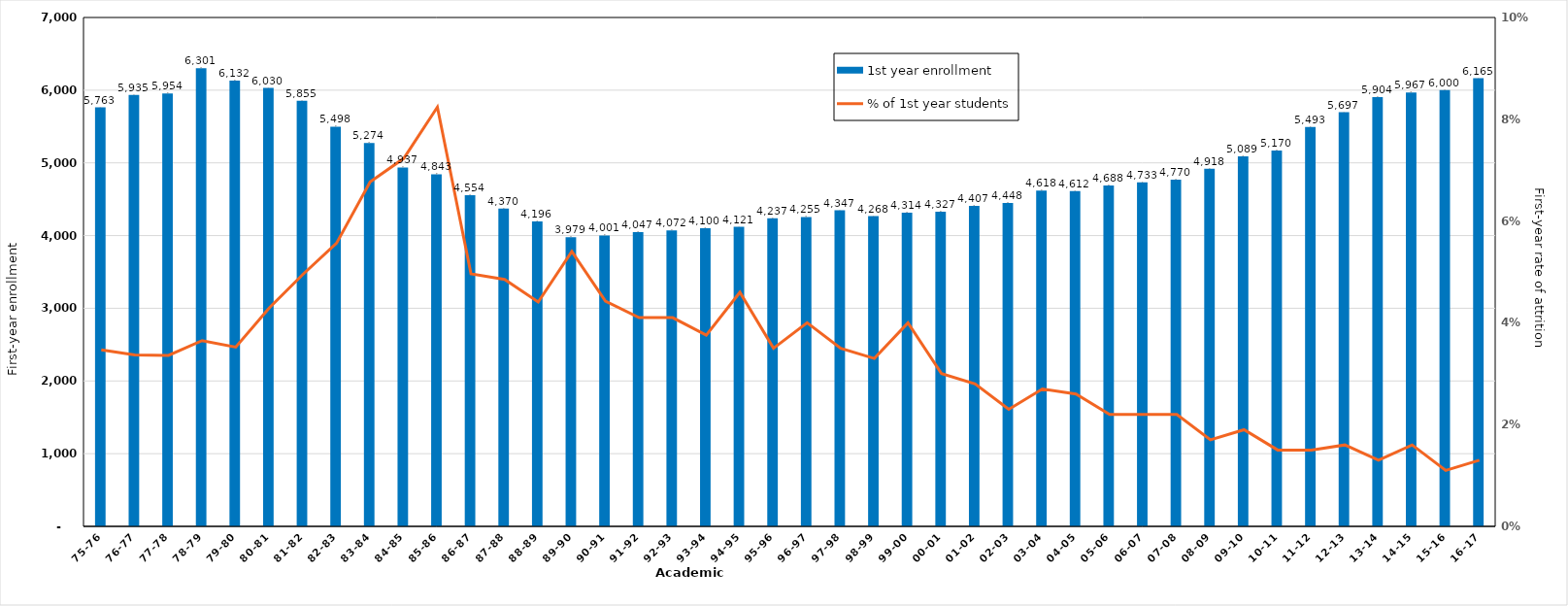
| Category | 1st year enrollment |
|---|---|
| 75-76 | 5763 |
| 76-77 | 5935 |
| 77-78 | 5954 |
| 78-79 | 6301 |
| 79-80 | 6132 |
| 80-81 | 6030 |
| 81-82 | 5855 |
| 82-83 | 5498 |
| 83-84 | 5274 |
| 84-85 | 4937 |
| 85-86 | 4843 |
| 86-87 | 4554 |
| 87-88 | 4370 |
| 88-89 | 4196 |
| 89-90 | 3979 |
| 90-91 | 4001 |
| 91-92 | 4047 |
| 92-93 | 4072 |
| 93-94 | 4100 |
| 94-95 | 4121 |
| 95-96 | 4237 |
| 96-97 | 4255 |
| 97-98 | 4347 |
| 98-99 | 4268 |
| 99-00 | 4314 |
| 00-01 | 4327 |
| 01-02 | 4407 |
| 02-03 | 4448 |
| 03-04 | 4618 |
| 04-05 | 4612 |
| 05-06 | 4688 |
| 06-07 | 4733 |
| 07-08 | 4770 |
| 08-09 | 4918 |
| 09-10 | 5089 |
| 10-11 | 5170 |
| 11-12 | 5493 |
| 12-13 | 5697 |
| 13-14 | 5904 |
| 14-15 | 5967 |
| 15-16 | 6000 |
| 16-17 | 6165 |